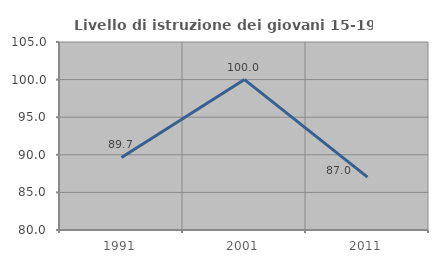
| Category | Livello di istruzione dei giovani 15-19 anni |
|---|---|
| 1991.0 | 89.655 |
| 2001.0 | 100 |
| 2011.0 | 87.037 |